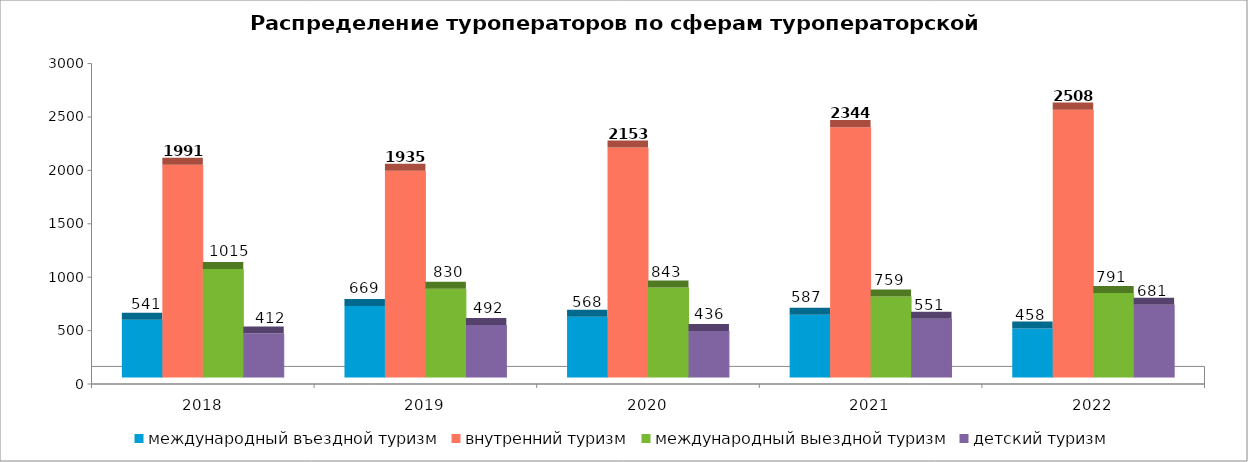
| Category | международный въездной туризм | внутренний туризм | международный выездной туризм | детский туризм |
|---|---|---|---|---|
| 2018.0 | 541 | 1991 | 1015 | 412 |
| 2019.0 | 669 | 1935 | 830 | 492 |
| 2020.0 | 568 | 2153 | 843 | 436 |
| 2021.0 | 587 | 2344 | 759 | 551 |
| 2022.0 | 458 | 2508 | 791 | 681 |